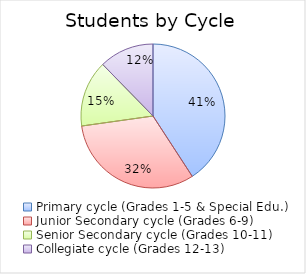
| Category | Series 0 |
|---|---|
| Primary cycle (Grades 1-5 & Special Edu.) | 1700666 |
| Junior Secondary cycle (Grades 6-9) | 1331069 |
| Senior Secondary cycle (Grades 10-11) | 621520 |
| Collegiate cycle (Grades 12-13) | 512700 |